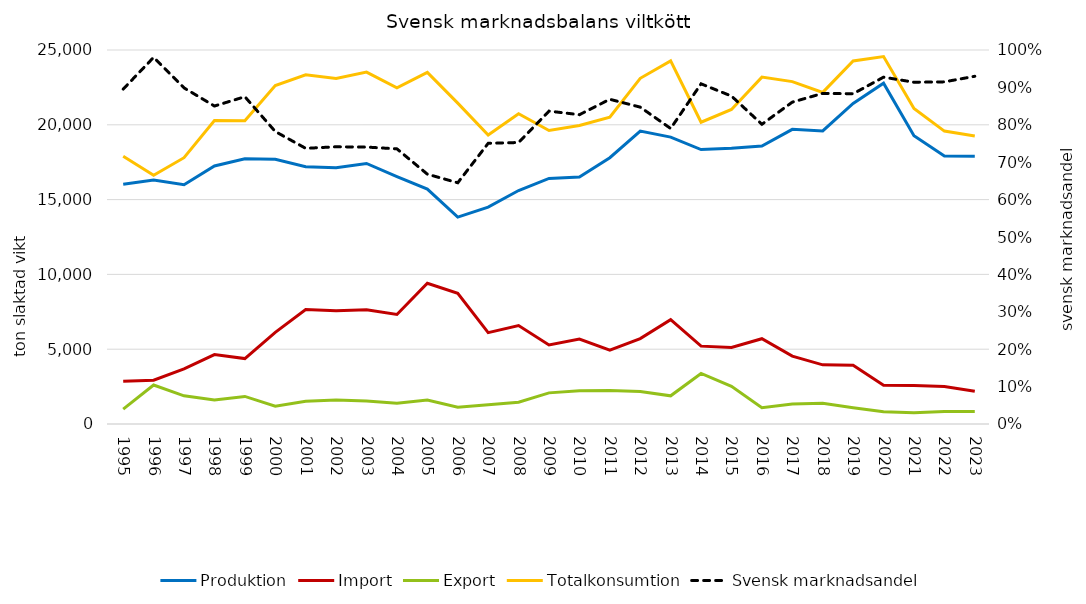
| Category | Produktion | Import | Export | Totalkonsumtion |
|---|---|---|---|---|
| 1995.0 | 16026.455 | 2861 | 990 | 17897.455 |
| 1996.0 | 16302.126 | 2932 | 2604 | 16630.126 |
| 1997.0 | 15997.997 | 3684 | 1881 | 17800.997 |
| 1998.0 | 17251.257 | 4639 | 1599 | 20291.257 |
| 1999.0 | 17734.945 | 4374 | 1842 | 20266.945 |
| 2000.0 | 17690.556 | 6125 | 1194 | 22621.556 |
| 2001.0 | 17202.081 | 7651 | 1514 | 23339.081 |
| 2002.0 | 17121.911 | 7575 | 1597 | 23099.911 |
| 2003.0 | 17416.258 | 7636 | 1531 | 23521.258 |
| 2004.0 | 16536.394 | 7324 | 1382 | 22478.394 |
| 2005.0 | 15698 | 9408 | 1606 | 23500 |
| 2006.0 | 13832 | 8735 | 1121 | 21446 |
| 2007.0 | 14494.518 | 6105 | 1285 | 19314.518 |
| 2008.0 | 15608.874 | 6582 | 1453 | 20737.874 |
| 2009.0 | 16411.813 | 5287 | 2081 | 19617.813 |
| 2010.0 | 16505.223 | 5679 | 2227 | 19957.223 |
| 2011.0 | 17801.68 | 4936 | 2234 | 20503.68 |
| 2012.0 | 19578 | 5706 | 2176 | 23108 |
| 2013.0 | 19178 | 6977 | 1883 | 24272 |
| 2014.0 | 18347 | 5205 | 3381 | 20171 |
| 2015.0 | 18435 | 5110 | 2520 | 21025 |
| 2016.0 | 18581 | 5701 | 1095 | 23187 |
| 2017.0 | 19697 | 4534 | 1344 | 22887 |
| 2018.0 | 19594 | 3954 | 1383 | 22165 |
| 2019.0 | 21430 | 3928 | 1088 | 24270 |
| 2020.0 | 22780 | 2598 | 814 | 24564 |
| 2021.0 | 19272 | 2576 | 759 | 21089 |
| 2022.0 | 17912 | 2505 | 837 | 19580 |
| 2023.0 | 17896 | 2191 | 838 | 19249 |